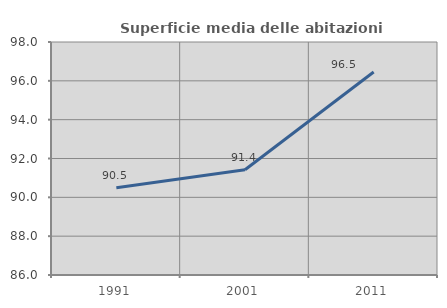
| Category | Superficie media delle abitazioni occupate |
|---|---|
| 1991.0 | 90.498 |
| 2001.0 | 91.424 |
| 2011.0 | 96.453 |